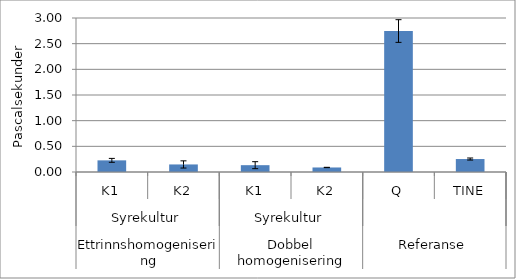
| Category | Series 0 |
|---|---|
| 0 | 0.227 |
| 1 | 0.147 |
| 2 | 0.133 |
| 3 | 0.088 |
| 4 | 2.746 |
| 5 | 0.253 |